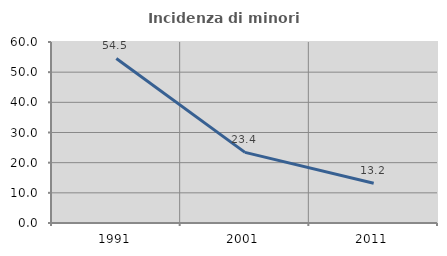
| Category | Incidenza di minori stranieri |
|---|---|
| 1991.0 | 54.545 |
| 2001.0 | 23.404 |
| 2011.0 | 13.194 |